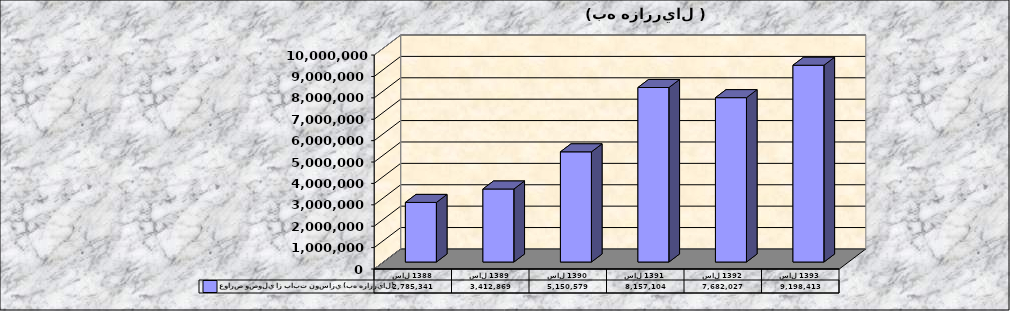
| Category | عوارض وصولي از بابت نوسازي (به هزارريال) |
|---|---|
| سال 1388 | 2785341 |
| سال 1389 | 3412869 |
| سال 1390 | 5150579 |
| سال 1391 | 8157104 |
| سال 1392 | 7682027 |
| سال 1393 | 9198413 |